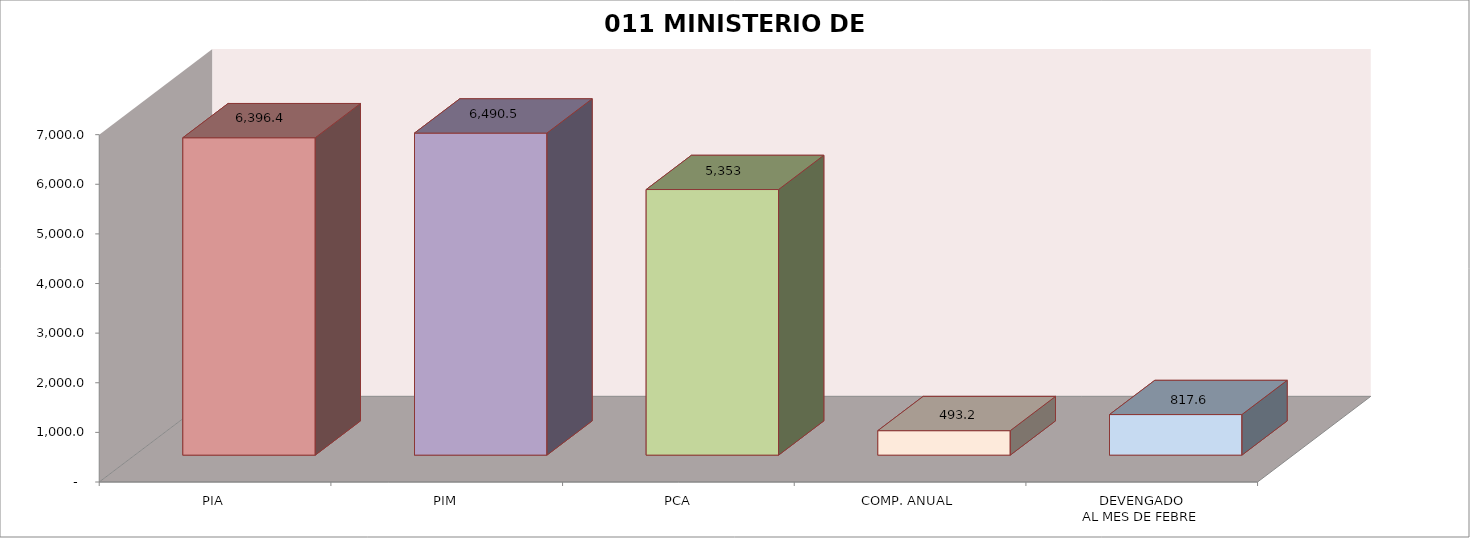
| Category | 011 MINISTERIO DE SALUD |
|---|---|
| PIA | 6396.414 |
| PIM | 6490.535 |
| PCA | 5352.81 |
| COMP. ANUAL | 493.206 |
| DEVENGADO
AL MES DE FEBRE | 817.61 |